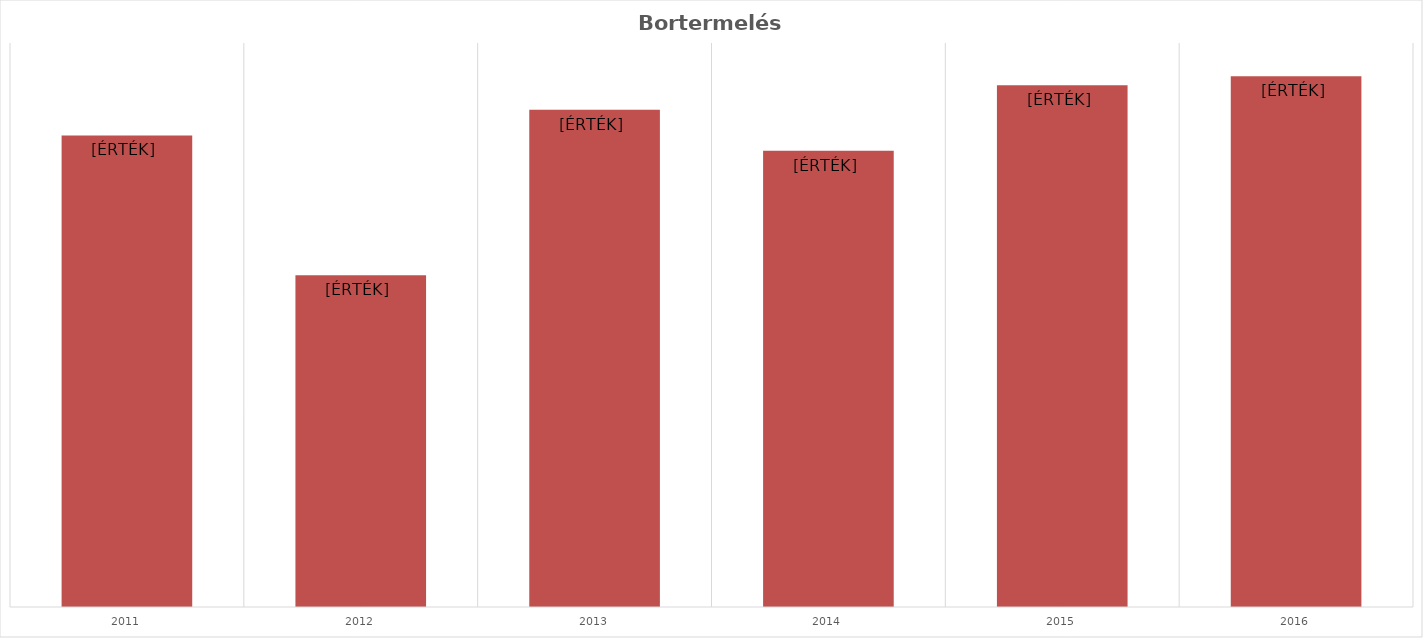
| Category | Bortermelés |
|---|---|
| 2011.0 | 2508254 |
| 2012.0 | 1765242 |
| 2013.0 | 2644449 |
| 2014.0 | 2426814 |
| 2015.0 | 2774991 |
| 2016.0 | 2822865 |